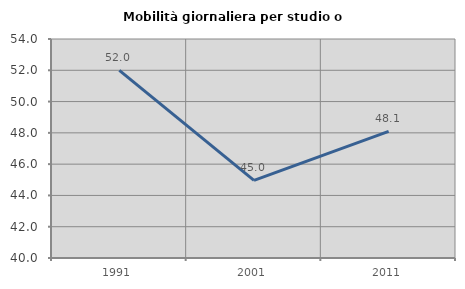
| Category | Mobilità giornaliera per studio o lavoro |
|---|---|
| 1991.0 | 51.995 |
| 2001.0 | 44.958 |
| 2011.0 | 48.097 |